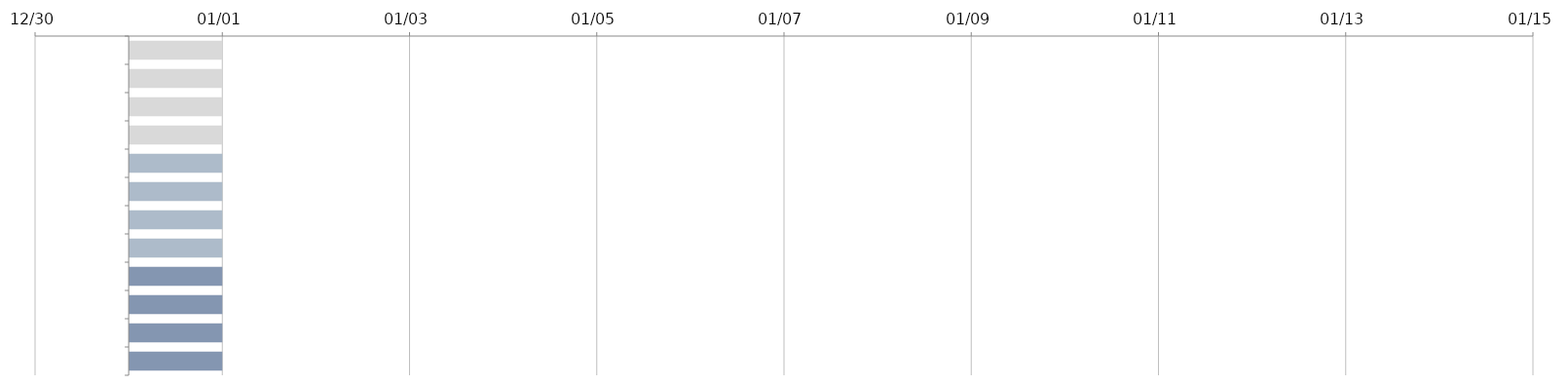
| Category | ANFANG | TAGE |
|---|---|---|
|  |  | 1 |
|  |  | 1 |
|  |  | 1 |
|  |  | 1 |
|  |  | 1 |
|  |  | 1 |
|  |  | 1 |
|  |  | 1 |
|  |  | 1 |
|  |  | 1 |
|  |  | 1 |
|  |  | 1 |